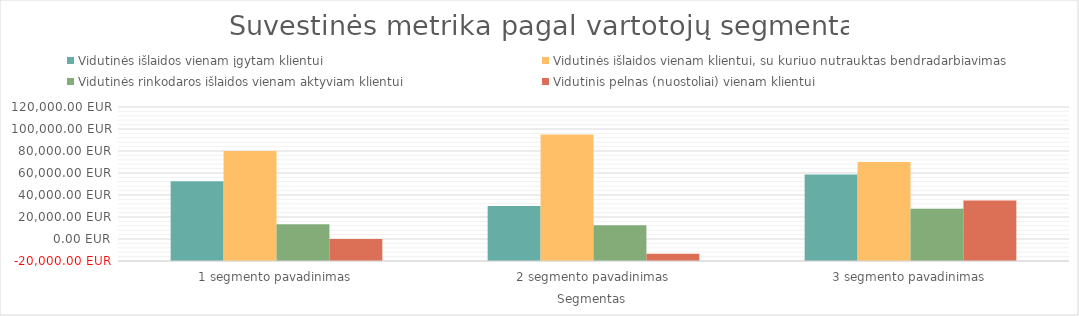
| Category | Vidutinės išlaidos vienam įgytam klientui | Vidutinės išlaidos vienam klientui, su kuriuo nutrauktas bendradarbiavimas | Vidutinės rinkodaros išlaidos vienam aktyviam klientui | Vidutinis pelnas (nuostoliai) vienam klientui |
|---|---|---|---|---|
| 1 segmento pavadinimas | 52500 | 80000 | 13333.333 | 0 |
| 2 segmento pavadinimas | 30000 | 95000 | 12500 | -13500 |
| 3 segmento pavadinimas | 58750 | 70000 | 27500 | 35000 |